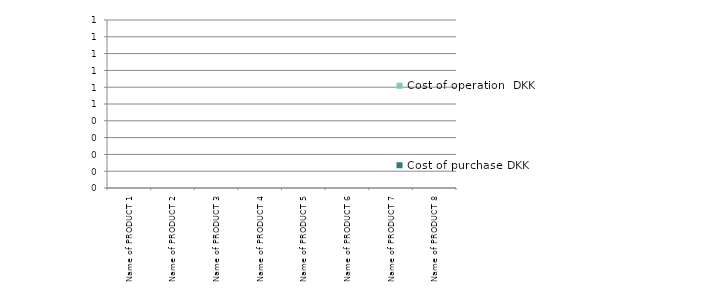
| Category | Cost of purchase DKK | Cost of operation  DKK |
|---|---|---|
| Name of PRODUCT 1 | 0 | 0 |
| Name of PRODUCT 2 | 0 | 0 |
| Name of PRODUCT 3 | 0 | 0 |
| Name of PRODUCT 4 | 0 | 0 |
| Name of PRODUCT 5 | 0 | 0 |
| Name of PRODUCT 6 | 0 | 0 |
| Name of PRODUCT 7 | 0 | 0 |
| Name of PRODUCT 8 | 0 | 0 |